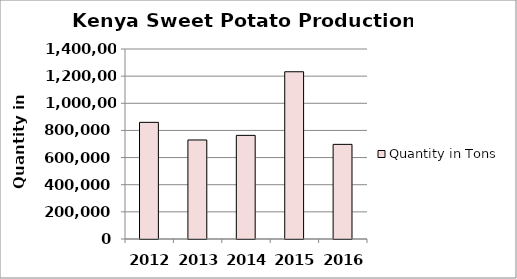
| Category | Quantity in Tons |
|---|---|
| 2012.0 | 859549 |
| 2013.0 | 729645 |
| 2014.0 | 763643 |
| 2015.0 | 1232332 |
| 2016.0 | 697324 |